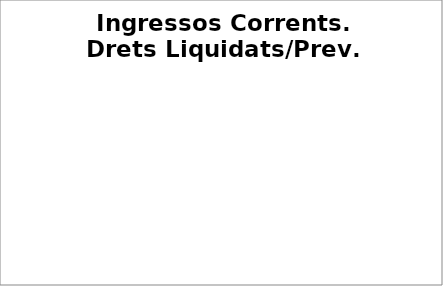
| Category | Series 0 |
|---|---|
| Impostos locals | 0.483 |
| Participació Tributs de l'Estat | 0.488 |
| Taxes i altres ingressos | 0.414 |
| Transferències corrents (exc. FCF) | 0.696 |
| Ingressos patrimonials | 0.186 |
| Ingressos corrents | 0.479 |